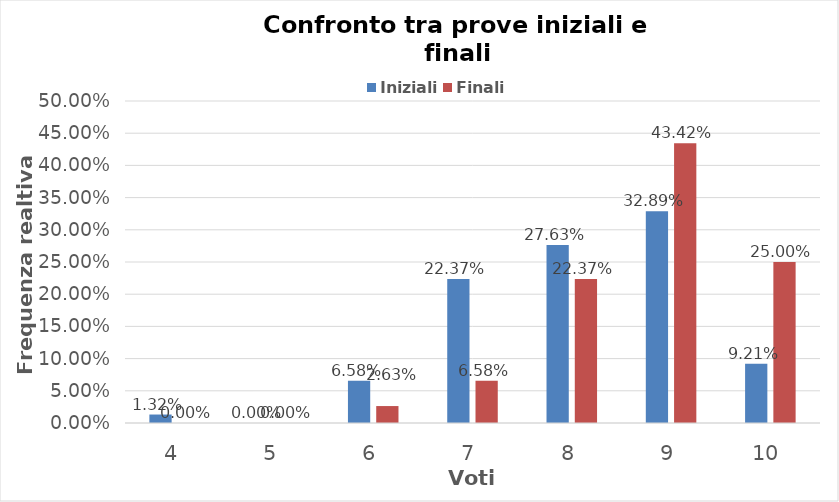
| Category | Iniziali | Finali |
|---|---|---|
| 4.0 | 0.013 | 0 |
| 5.0 | 0 | 0 |
| 6.0 | 0.066 | 0.026 |
| 7.0 | 0.224 | 0.066 |
| 8.0 | 0.276 | 0.224 |
| 9.0 | 0.329 | 0.434 |
| 10.0 | 0.092 | 0.25 |